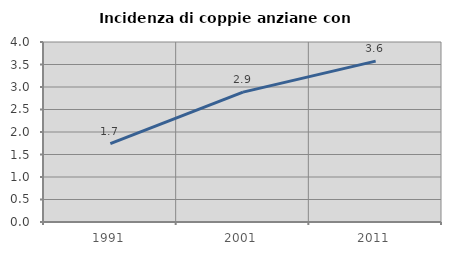
| Category | Incidenza di coppie anziane con figli |
|---|---|
| 1991.0 | 1.742 |
| 2001.0 | 2.887 |
| 2011.0 | 3.575 |